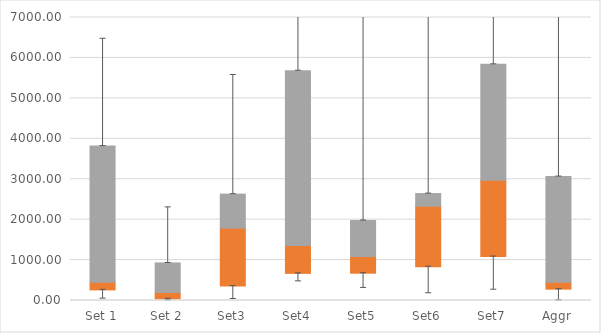
| Category | Q1 | Median-Q1 | Q3-Median |
|---|---|---|---|
| Set 1 | 262.42 | 191.104 | 3366.661 |
| Set 2 | 42.812 | 155.188 | 730.897 |
| Set3 | 356.171 | 1433.594 | 841.4 |
| Set4 | 670.956 | 688.631 | 4324.879 |
| Set5 | 674.968 | 410.28 | 893.907 |
| Set6 | 836.609 | 1495.122 | 313.481 |
| Set7 | 1086.668 | 1888.568 | 2867.622 |
| Aggr | 280.866 | 172.657 | 2613.06 |